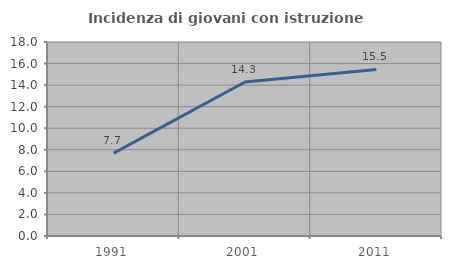
| Category | Incidenza di giovani con istruzione universitaria |
|---|---|
| 1991.0 | 7.692 |
| 2001.0 | 14.286 |
| 2011.0 | 15.455 |